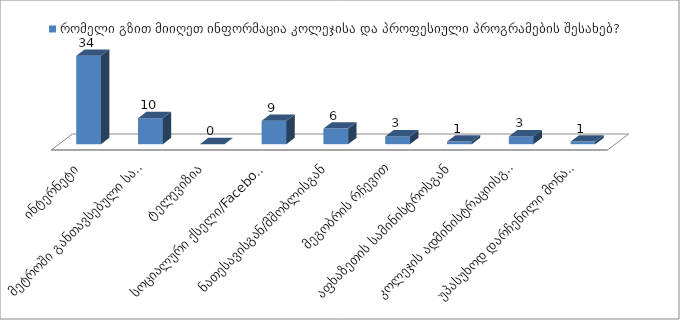
| Category | რომელი გზით მიიღეთ ინფორმაცია კოლეჯისა და პროფესიული პროგრამების შესახებ? |
|---|---|
| ინტერნეტი | 34 |
| მეტროში განთავსებული სარეკლამო ბანერი | 10 |
| ტელევიზია | 0 |
| სოციალური ქსელი/Facebook | 9 |
| ნათესავისგან/მშობლისგან | 6 |
| მეგობრის რჩევით | 3 |
| აფხაზეთის სამინისტროსგან | 1 |
| კოლეჯის ადმინისტრაციისგან ან ლექტორისგან | 3 |
| უპასუხოდ დარჩენილი მონაცემი | 1 |